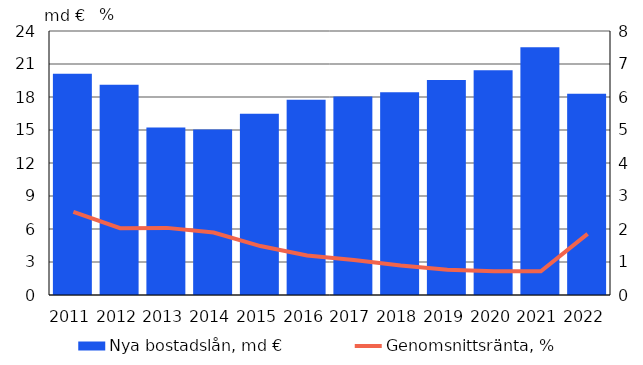
| Category | Nya bostadslån, md € |
|---|---|
| 2011.0 | 20.124 |
| 2012.0 | 19.114 |
| 2013.0 | 15.22 |
| 2014.0 | 15.052 |
| 2015.0 | 16.482 |
| 2016.0 | 17.75 |
| 2017.0 | 18.04 |
| 2018.0 | 18.442 |
| 2019.0 | 19.547 |
| 2020.0 | 20.424 |
| 2021.0 | 22.533 |
| 2022.0 | 18.299 |